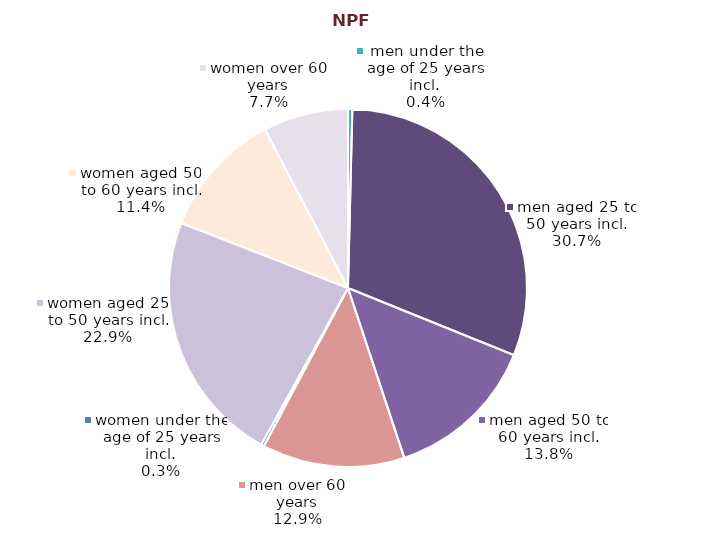
| Category | Series 0 |
|---|---|
| women under the age of 25 years incl. | 2313 |
| women aged 25 to 50 years incl. | 200616 |
| women aged 50 to 60 years incl. | 99960 |
| women over 60 years | 67418 |
| men under the age of 25 years incl. | 3385 |
| men aged 25 to 50 years incl. | 269492 |
| men aged 50 to 60 years incl. | 120972 |
| men over 60 years | 112856 |